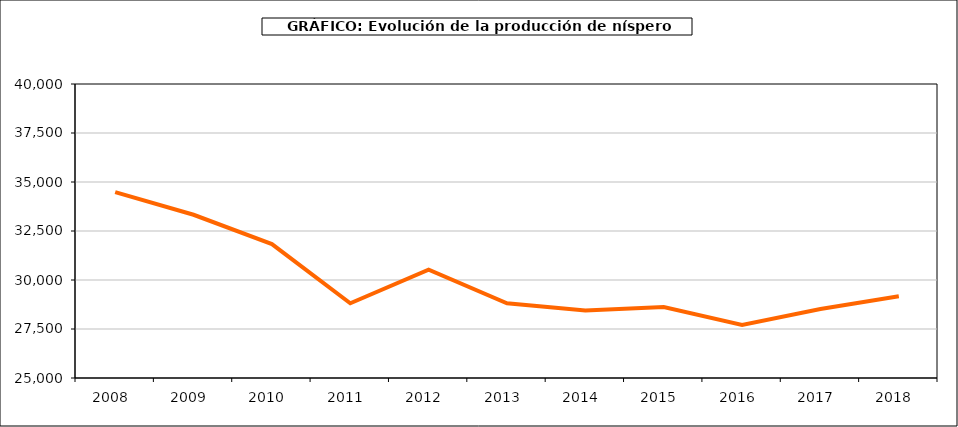
| Category | producción níspero |
|---|---|
| 2008.0 | 34484 |
| 2009.0 | 33328 |
| 2010.0 | 31834 |
| 2011.0 | 28812 |
| 2012.0 | 30529 |
| 2013.0 | 28815 |
| 2014.0 | 28449 |
| 2015.0 | 28620 |
| 2016.0 | 27712 |
| 2017.0 | 28522 |
| 2018.0 | 29173 |